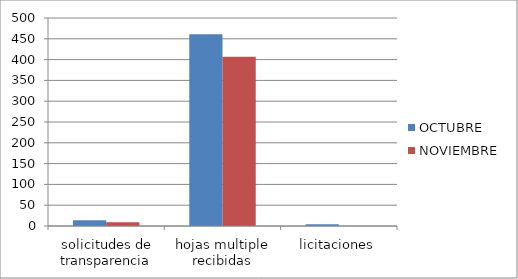
| Category | OCTUBRE | NOVIEMBRE |
|---|---|---|
| solicitudes de transparencia | 14 | 9 |
| hojas multiple recibidas | 461 | 407 |
| licitaciones | 4 | 0 |